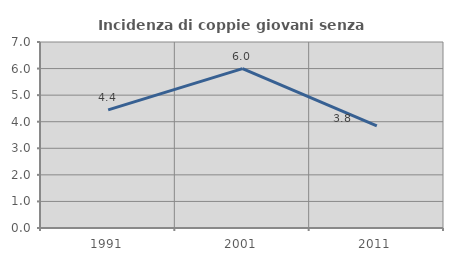
| Category | Incidenza di coppie giovani senza figli |
|---|---|
| 1991.0 | 4.444 |
| 2001.0 | 6 |
| 2011.0 | 3.846 |